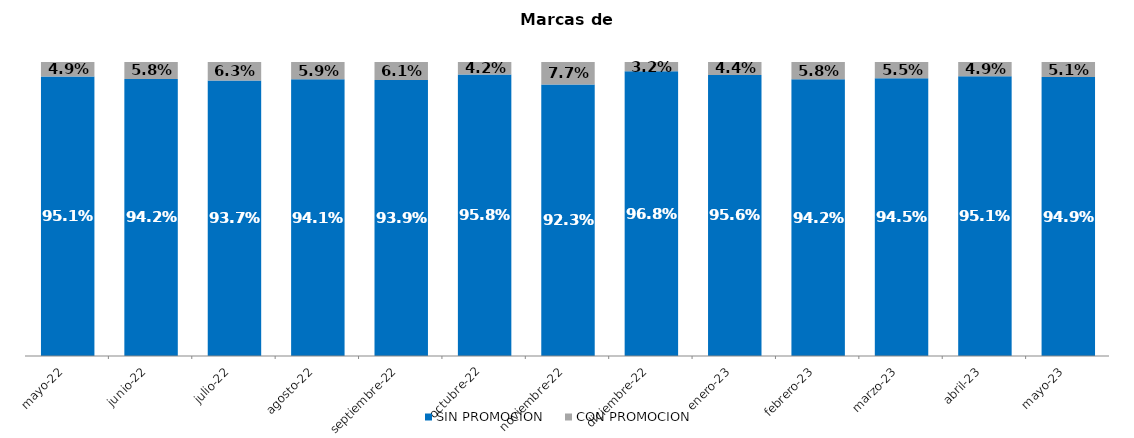
| Category | SIN PROMOCION   | CON PROMOCION   |
|---|---|---|
| 2022-05-01 | 0.951 | 0.049 |
| 2022-06-01 | 0.942 | 0.058 |
| 2022-07-01 | 0.937 | 0.063 |
| 2022-08-01 | 0.941 | 0.059 |
| 2022-09-01 | 0.939 | 0.061 |
| 2022-10-01 | 0.958 | 0.042 |
| 2022-11-01 | 0.923 | 0.077 |
| 2022-12-01 | 0.968 | 0.032 |
| 2023-01-01 | 0.956 | 0.044 |
| 2023-02-01 | 0.942 | 0.058 |
| 2023-03-01 | 0.945 | 0.055 |
| 2023-04-01 | 0.951 | 0.049 |
| 2023-05-01 | 0.949 | 0.051 |